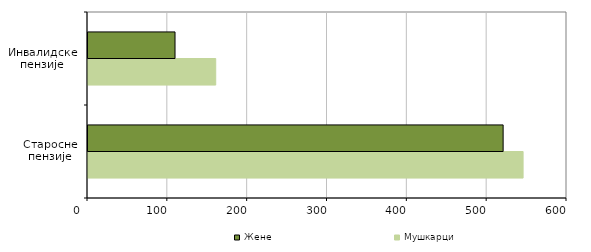
| Category | Мушкарци  | Жене  |
|---|---|---|
| Старосне
пензије | 545 | 520 |
| Инвалидске
пензије | 160 | 109 |